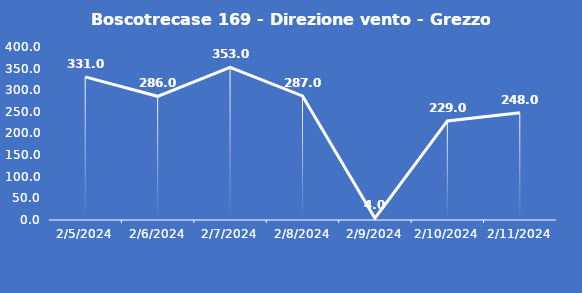
| Category | Boscotrecase 169 - Direzione vento - Grezzo (°N) |
|---|---|
| 2/5/24 | 331 |
| 2/6/24 | 286 |
| 2/7/24 | 353 |
| 2/8/24 | 287 |
| 2/9/24 | 4 |
| 2/10/24 | 229 |
| 2/11/24 | 248 |